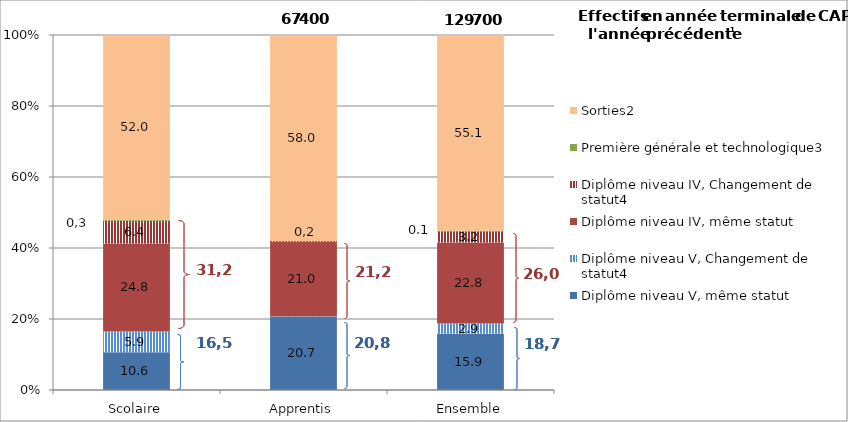
| Category | Diplôme niveau V, même statut | Diplôme niveau V, Changement de statut4 | Diplôme niveau IV, même statut | Diplôme niveau IV, Changement de statut4 | Première générale et technologique3 | Sorties2 |
|---|---|---|---|---|---|---|
| Scolaire | 10.625 | 5.856 | 24.796 | 6.418 | 0.258 | 52.047 |
| Apprentis | 20.699 | 0.08 | 21.007 | 0.197 | 0.012 | 57.995 |
| Ensemble | 15.856 | 2.857 | 22.829 | 3.187 | 0.13 | 55.136 |